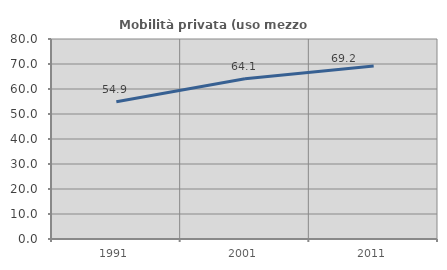
| Category | Mobilità privata (uso mezzo privato) |
|---|---|
| 1991.0 | 54.89 |
| 2001.0 | 64.068 |
| 2011.0 | 69.219 |